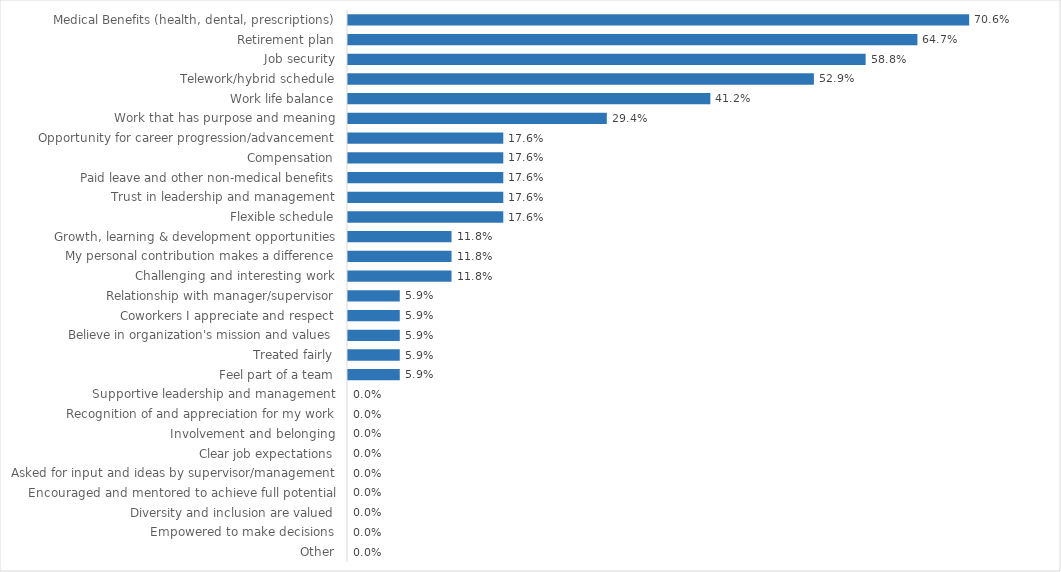
| Category | State Treasurer |
|---|---|
| Medical Benefits (health, dental, prescriptions) | 0.706 |
| Retirement plan | 0.647 |
| Job security | 0.588 |
| Telework/hybrid schedule | 0.529 |
| Work life balance | 0.412 |
| Work that has purpose and meaning | 0.294 |
| Opportunity for career progression/advancement | 0.176 |
| Compensation | 0.176 |
| Paid leave and other non-medical benefits | 0.176 |
| Trust in leadership and management | 0.176 |
| Flexible schedule | 0.176 |
| Growth, learning & development opportunities | 0.118 |
| My personal contribution makes a difference | 0.118 |
| Challenging and interesting work | 0.118 |
| Relationship with manager/supervisor | 0.059 |
| Coworkers I appreciate and respect | 0.059 |
| Believe in organization's mission and values | 0.059 |
| Treated fairly | 0.059 |
| Feel part of a team | 0.059 |
| Supportive leadership and management | 0 |
| Recognition of and appreciation for my work | 0 |
| Involvement and belonging | 0 |
| Clear job expectations | 0 |
| Asked for input and ideas by supervisor/management | 0 |
| Encouraged and mentored to achieve full potential | 0 |
| Diversity and inclusion are valued | 0 |
| Empowered to make decisions | 0 |
| Other | 0 |